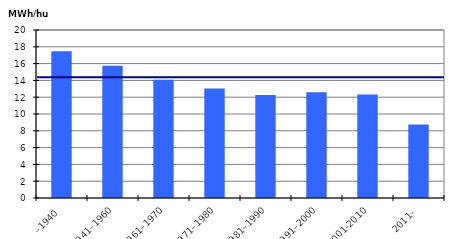
| Category | MWH/hus |
|---|---|
| –1940 | 17.463 |
| 1941–1960 | 15.738 |
| 1961–1970 | 14.073 |
| 1971–1980 | 13.041 |
| 1981–1990 | 12.262 |
| 1991–2000 | 12.603 |
| 2001-2010 | 12.312 |
| 2011- | 8.752 |